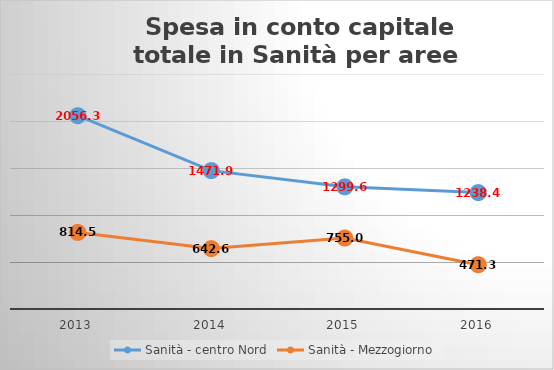
| Category | Sanità - centro Nord | Sanità - Mezzogiorno |
|---|---|---|
| 2013.0 | 2056.31 | 814.51 |
| 2014.0 | 1471.93 | 642.61 |
| 2015.0 | 1299.65 | 755.03 |
| 2016.0 | 1238.439 | 471.365 |